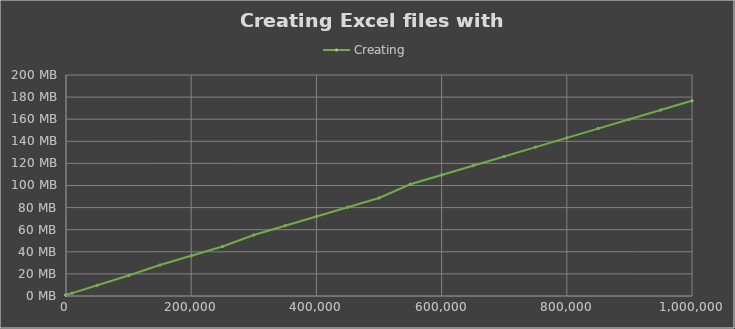
| Category | Creating |
|---|---|
| 1.0 | 0.823 |
| 10.0 | 0.825 |
| 100.0 | 0.848 |
| 1000.0 | 1.011 |
| 10000.0 | 2.62 |
| 50000.0 | 9.7 |
| 100000.0 | 18.6 |
| 150000.0 | 27.99 |
| 200000.0 | 36.38 |
| 250000.0 | 44.78 |
| 300000.0 | 55.17 |
| 350000.0 | 63.56 |
| 400000.0 | 71.95 |
| 450000.0 | 80.35 |
| 500000.0 | 88.74 |
| 550000.0 | 101.13 |
| 600000.0 | 109.53 |
| 650000.0 | 117.92 |
| 700000.0 | 126.31 |
| 750000.0 | 134.71 |
| 800000.0 | 143.1 |
| 850000.0 | 151.49 |
| 900000.0 | 159.88 |
| 950000.0 | 168.27 |
| 1000000.0 | 176.67 |